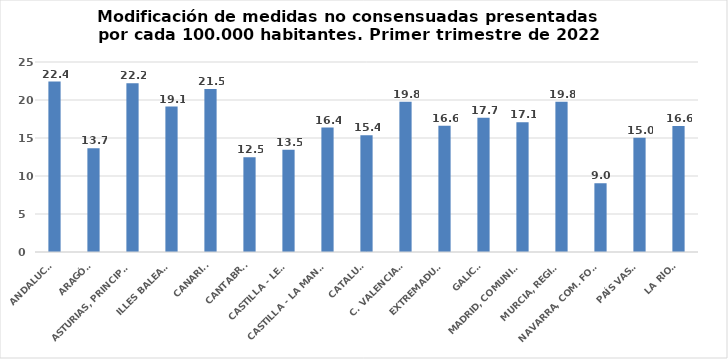
| Category | Series 0 |
|---|---|
| ANDALUCÍA | 22.432 |
| ARAGÓN | 13.657 |
| ASTURIAS, PRINCIPADO | 22.2 |
| ILLES BALEARS | 19.129 |
| CANARIAS | 21.457 |
| CANTABRIA | 12.474 |
| CASTILLA - LEÓN | 13.46 |
| CASTILLA - LA MANCHA | 16.373 |
| CATALUÑA | 15.353 |
| C. VALENCIANA | 19.761 |
| EXTREMADURA | 16.6 |
| GALICIA | 17.664 |
| MADRID, COMUNIDAD | 17.081 |
| MURCIA, REGIÓN | 19.785 |
| NAVARRA, COM. FORAL | 9.041 |
| PAÍS VASCO | 15.042 |
| LA RIOJA | 16.589 |